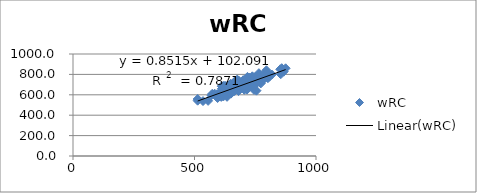
| Category | wRC |
|---|---|
| 796.0 | 840.142 |
| 855.0 | 801.806 |
| 875.0 | 859.801 |
| 853.0 | 850.014 |
| 787.0 | 792.179 |
| 757.0 | 739.256 |
| 755.0 | 722.133 |
| 787.0 | 790.506 |
| 730.0 | 746.922 |
| 767.0 | 764.469 |
| 676.0 | 749.236 |
| 758.0 | 760.035 |
| 762.0 | 789.84 |
| 781.0 | 793.26 |
| 808.0 | 778.321 |
| 790.0 | 791.37 |
| 765.0 | 812.01 |
| 706.0 | 702.711 |
| 718.0 | 744.788 |
| 783.0 | 746.573 |
| 751.0 | 769.577 |
| 726.0 | 769.347 |
| 818.0 | 798.842 |
| 752.0 | 742.73 |
| 859.0 | 860.712 |
| 718.0 | 761.774 |
| 676.0 | 689.732 |
| 804.0 | 804.122 |
| 733.0 | 738.829 |
| 718.0 | 775.744 |
| 649.0 | 708.198 |
| 867.0 | 827.201 |
| 736.0 | 726.994 |
| 651.0 | 655.787 |
| 770.0 | 764.205 |
| 750.0 | 774.296 |
| 730.0 | 710.793 |
| 731.0 | 721.856 |
| 721.0 | 701.277 |
| 629.0 | 685.159 |
| 734.0 | 688.951 |
| 701.0 | 742.08 |
| 648.0 | 652.407 |
| 772.0 | 740.298 |
| 745.0 | 647.675 |
| 776.0 | 740.815 |
| 682.0 | 738.994 |
| 613.0 | 657.604 |
| 734.0 | 739.728 |
| 773.0 | 711.851 |
| 685.0 | 713.119 |
| 723.0 | 708.088 |
| 738.0 | 781.03 |
| 735.0 | 741.225 |
| 615.0 | 645.767 |
| 697.0 | 676.77 |
| 708.0 | 678.763 |
| 644.0 | 679.257 |
| 700.0 | 742 |
| 685.0 | 680.73 |
| 654.0 | 661.028 |
| 637.0 | 645.893 |
| 705.0 | 649.17 |
| 663.0 | 710.35 |
| 735.0 | 731.601 |
| 748.0 | 700.058 |
| 684.0 | 689.092 |
| 665.0 | 637.452 |
| 745.0 | 727.674 |
| 767.0 | 727.117 |
| 719.0 | 688.288 |
| 715.0 | 719.807 |
| 686.0 | 705.132 |
| 669.0 | 690.254 |
| 667.0 | 649.032 |
| 619.0 | 686.696 |
| 645.0 | 669.558 |
| 660.0 | 634.759 |
| 713.0 | 709.827 |
| 712.0 | 683.175 |
| 640.0 | 636.683 |
| 667.0 | 676.217 |
| 654.0 | 687.936 |
| 637.0 | 675.027 |
| 669.0 | 668.907 |
| 656.0 | 637.661 |
| 667.0 | 734.223 |
| 704.0 | 679.985 |
| 731.0 | 685.56 |
| 655.0 | 666.838 |
| 650.0 | 637.387 |
| 713.0 | 703.497 |
| 698.0 | 720.759 |
| 656.0 | 644.01 |
| 650.0 | 674.34 |
| 598.0 | 597.86 |
| 743.0 | 678.794 |
| 688.0 | 688.347 |
| 615.0 | 599.623 |
| 681.0 | 636.317 |
| 610.0 | 601.251 |
| 755.0 | 640.481 |
| 646.0 | 692.261 |
| 619.0 | 616.515 |
| 712.0 | 671.083 |
| 611.0 | 587.523 |
| 700.0 | 702.288 |
| 651.0 | 699.005 |
| 802.0 | 763.304 |
| 612.0 | 684.268 |
| 625.0 | 687.095 |
| 665.0 | 650.93 |
| 633.0 | 630.361 |
| 634.0 | 647.862 |
| 716.0 | 650.955 |
| 618.0 | 621.915 |
| 610.0 | 628.612 |
| 729.0 | 699.365 |
| 634.0 | 676.343 |
| 609.0 | 630.472 |
| 645.0 | 652.114 |
| 634.0 | 580.168 |
| 707.0 | 702.735 |
| 641.0 | 629.938 |
| 651.0 | 613.82 |
| 650.0 | 611.646 |
| 624.0 | 626.178 |
| 619.0 | 605.499 |
| 587.0 | 589.76 |
| 614.0 | 662.993 |
| 570.0 | 595.468 |
| 629.0 | 633.864 |
| 573.0 | 610.126 |
| 613.0 | 600.245 |
| 697.0 | 690.529 |
| 610.0 | 579.636 |
| 614.0 | 591.282 |
| 629.0 | 629.529 |
| 713.0 | 665.836 |
| 602.0 | 587.027 |
| 595.0 | 568.479 |
| 624.0 | 624.919 |
| 619.0 | 618.393 |
| 593.0 | 605.291 |
| 583.0 | 610.811 |
| 513.0 | 558.754 |
| 619.0 | 584.829 |
| 556.0 | 540.686 |
| 513.0 | 542.468 |
| 535.0 | 538.551 |